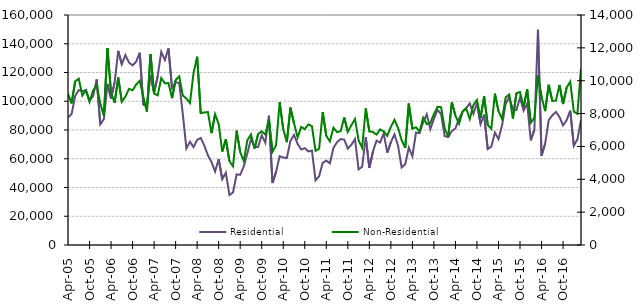
| Category | Residential |
|---|---|
| 2005-04-01 | 88840 |
| 2005-05-01 | 91030 |
| 2005-06-01 | 103700 |
| 2005-07-01 | 107770 |
| 2005-08-01 | 107040 |
| 2005-09-01 | 107710 |
| 2005-10-01 | 100650 |
| 2005-11-01 | 103570 |
| 2005-12-01 | 115150 |
| 2006-01-01 | 83980 |
| 2006-02-01 | 87550 |
| 2006-03-01 | 112090 |
| 2006-04-01 | 101830 |
| 2006-05-01 | 113160 |
| 2006-06-01 | 135030 |
| 2006-07-01 | 125720 |
| 2006-08-01 | 132180 |
| 2006-09-01 | 126890 |
| 2006-10-01 | 124980 |
| 2006-11-01 | 127530 |
| 2006-12-01 | 133770 |
| 2007-01-01 | 97580 |
| 2007-02-01 | 96560 |
| 2007-03-01 | 117970 |
| 2007-04-01 | 105780 |
| 2007-05-01 | 117560 |
| 2007-06-01 | 134370 |
| 2007-07-01 | 128660 |
| 2007-08-01 | 136790 |
| 2007-09-01 | 109250 |
| 2007-10-01 | 113080 |
| 2007-11-01 | 112770 |
| 2007-12-01 | 91140 |
| 2008-01-01 | 67220 |
| 2008-02-01 | 71820 |
| 2008-03-01 | 68100 |
| 2008-04-01 | 73130 |
| 2008-05-01 | 74470 |
| 2008-06-01 | 69150 |
| 2008-07-01 | 62400 |
| 2008-08-01 | 57810 |
| 2008-09-01 | 51080 |
| 2008-10-01 | 59710 |
| 2008-11-01 | 45780 |
| 2008-12-01 | 50260 |
| 2009-01-01 | 34750 |
| 2009-02-01 | 36580 |
| 2009-03-01 | 49130 |
| 2009-04-01 | 48840 |
| 2009-05-01 | 54720 |
| 2009-06-01 | 63710 |
| 2009-07-01 | 73760 |
| 2009-08-01 | 68080 |
| 2009-09-01 | 68260 |
| 2009-10-01 | 76320 |
| 2009-11-01 | 71150 |
| 2009-12-01 | 89920 |
| 2010-01-01 | 43110 |
| 2010-02-01 | 50920 |
| 2010-03-01 | 61810 |
| 2010-04-01 | 60830 |
| 2010-05-01 | 60500 |
| 2010-06-01 | 72370 |
| 2010-07-01 | 76590 |
| 2010-08-01 | 70320 |
| 2010-09-01 | 66440 |
| 2010-10-01 | 67380 |
| 2010-11-01 | 65080 |
| 2010-12-01 | 65650 |
| 2011-01-01 | 44970 |
| 2011-02-01 | 47830 |
| 2011-03-01 | 57200 |
| 2011-04-01 | 58700 |
| 2011-05-01 | 56820 |
| 2011-06-01 | 67500 |
| 2011-07-01 | 71550 |
| 2011-08-01 | 73720 |
| 2011-09-01 | 73310 |
| 2011-10-01 | 67030 |
| 2011-11-01 | 69730 |
| 2011-12-01 | 73780 |
| 2012-01-01 | 52630 |
| 2012-02-01 | 54440 |
| 2012-03-01 | 74960 |
| 2012-04-01 | 53590 |
| 2012-05-01 | 64960 |
| 2012-06-01 | 72590 |
| 2012-07-01 | 71240 |
| 2012-08-01 | 77690 |
| 2012-09-01 | 64200 |
| 2012-10-01 | 71490 |
| 2012-11-01 | 76910 |
| 2012-12-01 | 69100 |
| 2013-01-01 | 53990 |
| 2013-02-01 | 56120 |
| 2013-03-01 | 67740 |
| 2013-04-01 | 61780 |
| 2013-05-01 | 78170 |
| 2013-06-01 | 77850 |
| 2013-07-01 | 85310 |
| 2013-08-01 | 90850 |
| 2013-09-01 | 80640 |
| 2013-10-01 | 87730 |
| 2013-11-01 | 94020 |
| 2013-12-01 | 91030 |
| 2014-01-01 | 75750 |
| 2014-02-01 | 75100 |
| 2014-03-01 | 79280 |
| 2014-04-01 | 81140 |
| 2014-05-01 | 87930 |
| 2014-06-01 | 92950 |
| 2014-07-01 | 95430 |
| 2014-08-01 | 98450 |
| 2014-09-01 | 91170 |
| 2014-10-01 | 98630 |
| 2014-11-01 | 84150 |
| 2014-12-01 | 90650 |
| 2015-01-01 | 66750 |
| 2015-02-01 | 68390 |
| 2015-03-01 | 78240 |
| 2015-04-01 | 73690 |
| 2015-05-01 | 83310 |
| 2015-06-01 | 98200 |
| 2015-07-01 | 103160 |
| 2015-08-01 | 94260 |
| 2015-09-01 | 93940 |
| 2015-10-01 | 102540 |
| 2015-11-01 | 93490 |
| 2015-12-01 | 98400 |
| 2016-01-01 | 72750 |
| 2016-02-01 | 80110 |
| 2016-03-01 | 149710 |
| 2016-04-01 | 62150 |
| 2016-05-01 | 70470 |
| 2016-06-01 | 86830 |
| 2016-07-01 | 90200 |
| 2016-08-01 | 92620 |
| 2016-09-01 | 89080 |
| 2016-10-01 | 83230 |
| 2016-11-01 | 86860 |
| 2016-12-01 | 93490 |
| 2017-01-01 | 69000 |
| 2017-02-01 | 73560 |
| 2017-03-01 | 86810 |